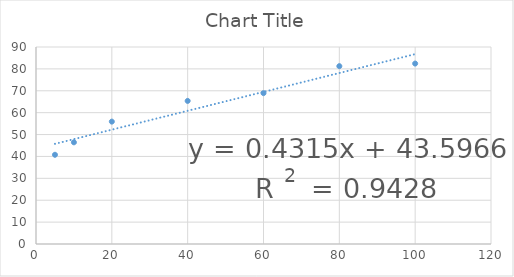
| Category | Series 0 |
|---|---|
| 5.0 | 40.76 |
| 10.0 | 46.453 |
| 20.0 | 55.912 |
| 40.0 | 65.372 |
| 60.0 | 68.919 |
| 80.0 | 81.25 |
| 100.0 | 82.432 |